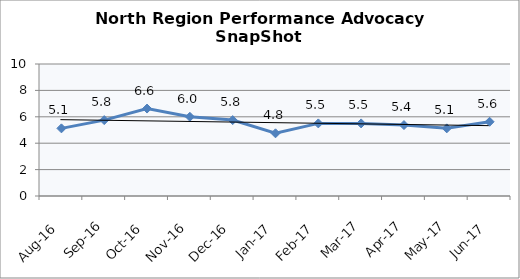
| Category | North Region |
|---|---|
| Aug-16 | 5.125 |
| Sep-16 | 5.75 |
| Oct-16 | 6.625 |
| Nov-16 | 6 |
| Dec-16 | 5.75 |
| Jan-17 | 4.75 |
| Feb-17 | 5.5 |
| Mar-17 | 5.5 |
| Apr-17 | 5.375 |
| May-17 | 5.125 |
| Jun-17 | 5.625 |